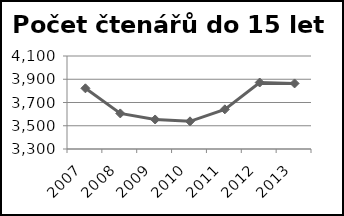
| Category | Počet čtenářů do 15 let |
|---|---|
| 2007.0 | 3822 |
| 2008.0 | 3606 |
| 2009.0 | 3554 |
| 2010.0 | 3538 |
| 2011.0 | 3641 |
| 2012.0 | 3872 |
| 2013.0 | 3864 |